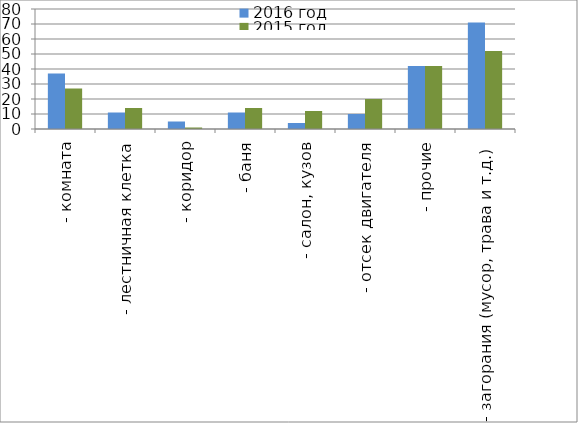
| Category | 2016 год | 2015 год |
|---|---|---|
|  - комната | 37 | 27 |
|  - лестничная клетка | 11 | 14 |
|  - коридор | 5 | 1 |
|  - баня | 11 | 14 |
|  - салон, кузов | 4 | 12 |
|  - отсек двигателя | 10 | 20 |
| - прочие | 42 | 42 |
| - загорания (мусор, трава и т.д.)  | 71 | 52 |